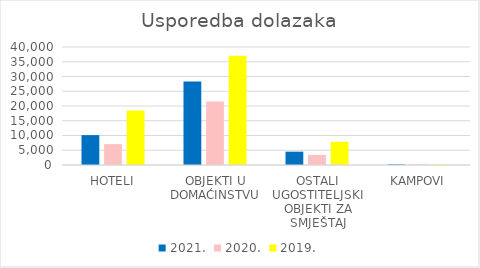
| Category | 2021. | 2020. | 2019. |
|---|---|---|---|
| HOTELI | 10124 | 7086 | 18438 |
| OBJEKTI U DOMAĆINSTVU | 28347 | 21529 | 37019 |
| OSTALI UGOSTITELJSKI OBJEKTI ZA SMJEŠTAJ | 4519 | 3416 | 7864 |
| KAMPOVI | 204 | 203 | 165 |